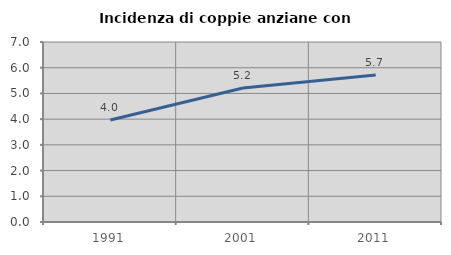
| Category | Incidenza di coppie anziane con figli |
|---|---|
| 1991.0 | 3.965 |
| 2001.0 | 5.213 |
| 2011.0 | 5.714 |